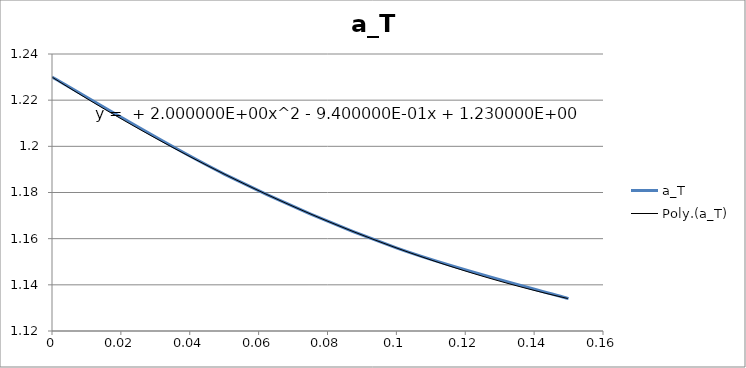
| Category | a_T |
|---|---|
| 0.0 | 1.23 |
| 0.05 | 1.188 |
| 0.1 | 1.156 |
| 0.15 | 1.134 |